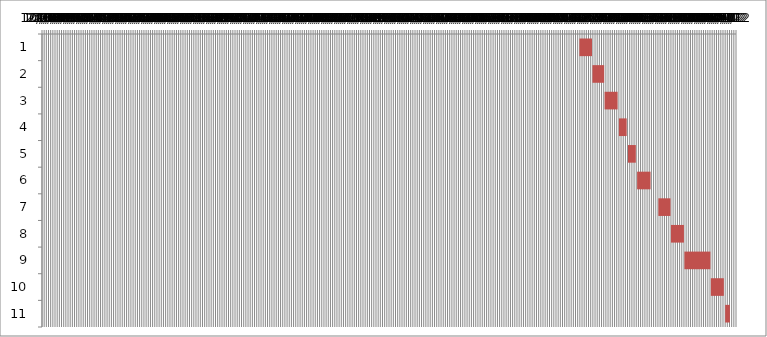
| Category | Fecha de inicio | DURACIÓN |
|---|---|---|
| 0 | 1/2/17 | 29 |
| 1 | 2/1/17 | 27 |
| 2 | 3/1/17 | 30 |
| 3 | 4/3/17 | 18 |
| 4 | 4/24/17 | 18 |
| 5 | 5/15/17 | 31 |
| 6 | 7/3/17 | 28 |
| 7 | 8/1/17 | 30 |
| 8 | 9/1/17 | 60 |
| 9 | 11/1/17 | 30 |
| 10 | 12/4/17 | 11 |